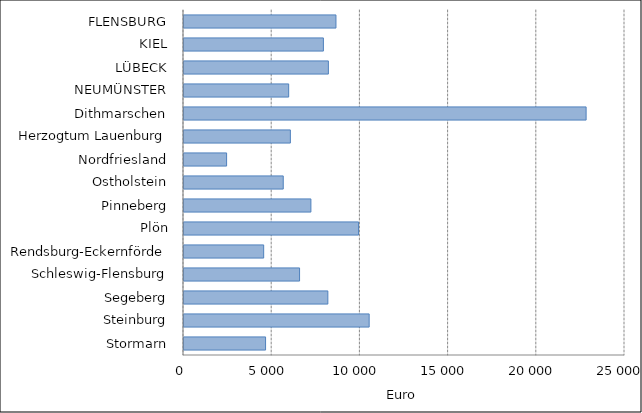
| Category | Euro |
|---|---|
| Stormarn | 4623.747 |
| Steinburg | 10496.978 |
| Segeberg | 8154.753 |
| Schleswig-Flensburg | 6551.668 |
| Rendsburg-Eckernförde | 4516.955 |
| Plön | 9895.441 |
| Pinneberg | 7193.67 |
| Ostholstein | 5625.934 |
| Nordfriesland | 2415.444 |
| Herzogtum Lauenburg | 6029.676 |
| Dithmarschen | 22795.643 |
| NEUMÜNSTER | 5933.973 |
| LÜBECK | 8185.382 |
| KIEL | 7902.524 |
| FLENSBURG | 8614.716 |